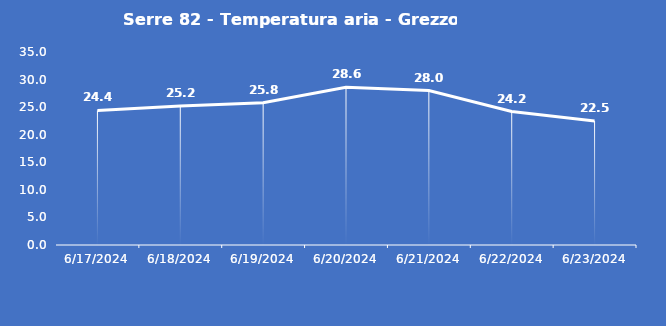
| Category | Serre 82 - Temperatura aria - Grezzo (°C) |
|---|---|
| 6/17/24 | 24.4 |
| 6/18/24 | 25.2 |
| 6/19/24 | 25.8 |
| 6/20/24 | 28.6 |
| 6/21/24 | 28 |
| 6/22/24 | 24.2 |
| 6/23/24 | 22.5 |